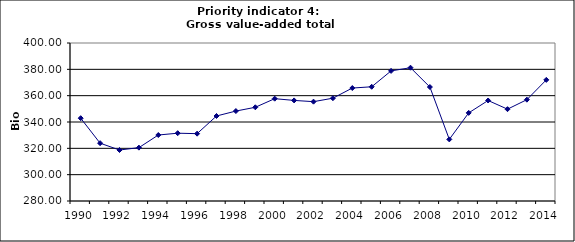
| Category | Gross value-added total industry, Bio Euro (EC95) |
|---|---|
| 1990 | 342.889 |
| 1991 | 323.916 |
| 1992 | 318.733 |
| 1993 | 320.521 |
| 1994 | 330.107 |
| 1995 | 331.502 |
| 1996 | 331.139 |
| 1997 | 344.559 |
| 1998 | 348.308 |
| 1999 | 351.175 |
| 2000 | 357.71 |
| 2001 | 356.396 |
| 2002 | 355.447 |
| 2003 | 358.084 |
| 2004 | 365.785 |
| 2005 | 366.755 |
| 2006 | 378.818 |
| 2007 | 381.223 |
| 2008 | 366.56 |
| 2009 | 326.803 |
| 2010 | 346.929 |
| 2011 | 356.336 |
| 2012 | 349.75 |
| 2013 | 356.964 |
| 2014 | 371.995 |